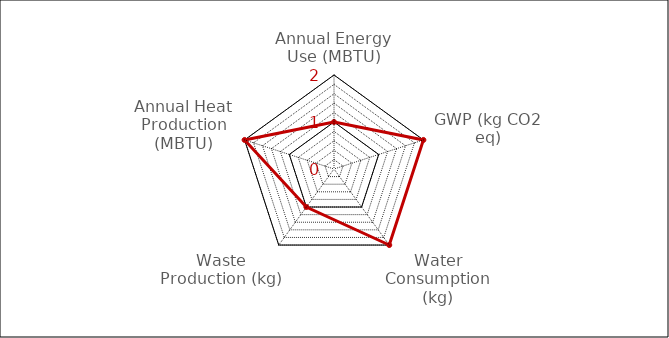
| Category | Series 0 |
|---|---|
| Annual Energy Use (MBTU) | 1 |
| GWP (kg CO2 eq) | 2 |
| Water Consumption (kg) | 2 |
| Waste Production (kg) | 1 |
| Annual Heat Production (MBTU) | 2 |